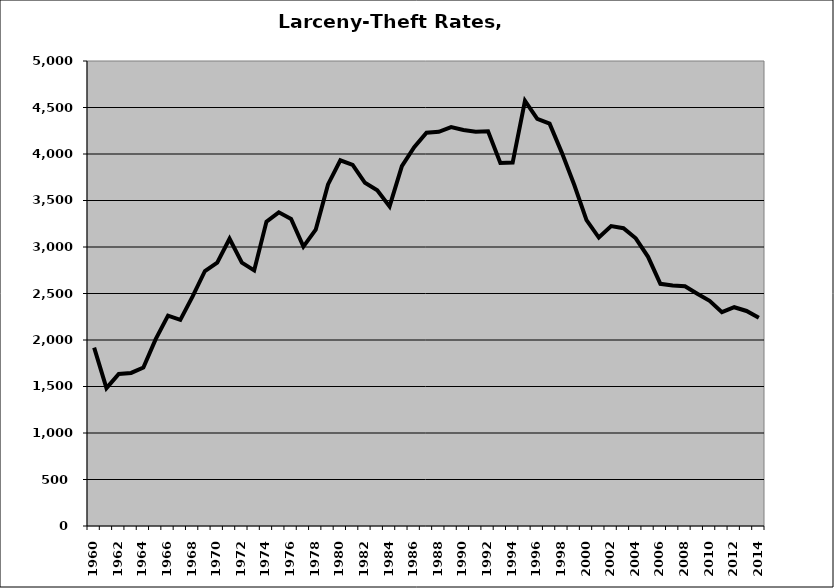
| Category | Larceny-Theft |
|---|---|
| 1960.0 | 1917.862 |
| 1961.0 | 1481.987 |
| 1962.0 | 1634.333 |
| 1963.0 | 1645.677 |
| 1964.0 | 1704.234 |
| 1965.0 | 2008.788 |
| 1966.0 | 2262.5 |
| 1967.0 | 2216.992 |
| 1968.0 | 2469.246 |
| 1969.0 | 2742.01 |
| 1970.0 | 2832.698 |
| 1971.0 | 3089.081 |
| 1972.0 | 2832.238 |
| 1973.0 | 2748.142 |
| 1974.0 | 3272.89 |
| 1975.0 | 3372.554 |
| 1976.0 | 3301.954 |
| 1977.0 | 3004.574 |
| 1978.0 | 3186.075 |
| 1979.0 | 3673.446 |
| 1980.0 | 3931.779 |
| 1981.0 | 3882.256 |
| 1982.0 | 3689.897 |
| 1983.0 | 3610.439 |
| 1984.0 | 3437.167 |
| 1985.0 | 3870.395 |
| 1986.0 | 4073.574 |
| 1987.0 | 4228.452 |
| 1988.0 | 4238.734 |
| 1989.0 | 4288.811 |
| 1990.0 | 4257.596 |
| 1991.0 | 4239.605 |
| 1992.0 | 4245.119 |
| 1993.0 | 3903.387 |
| 1994.0 | 3907.442 |
| 1995.0 | 4572.117 |
| 1996.0 | 4377.1 |
| 1997.0 | 4326.858 |
| 1998.0 | 4012.143 |
| 1999.0 | 3669.578 |
| 2000.0 | 3288.511 |
| 2001.0 | 3101.577 |
| 2002.0 | 3225.606 |
| 2003.0 | 3202.261 |
| 2004.0 | 3093.682 |
| 2005.0 | 2894.471 |
| 2006.0 | 2604.328 |
| 2007.0 | 2587.087 |
| 2008.0 | 2577.894 |
| 2009.0 | 2497.906 |
| 2010.0 | 2421.012 |
| 2011.0 | 2299.894 |
| 2012.0 | 2352.365 |
| 2013.0 | 2312.088 |
| 2014.0 | 2239.116 |